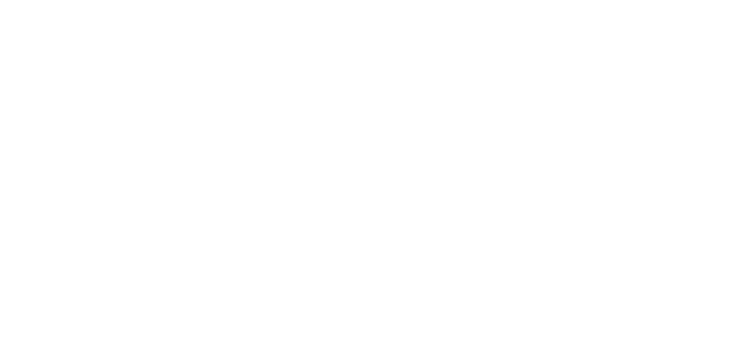
| Category | Total |
|---|---|
| chase costa | 50.792 |
| Alton Dillard | 50.194 |
| David brick | 50 |
| Debbie Stevens | 50 |
| Dan Brown | 46.958 |
| Rebecca Michaels | 46.864 |
| Keith Knowles | 45.703 |
| Matthew Garretson | 38.104 |
| Michael Dailey | 37.069 |
| Kristi Sarrett | 33.192 |